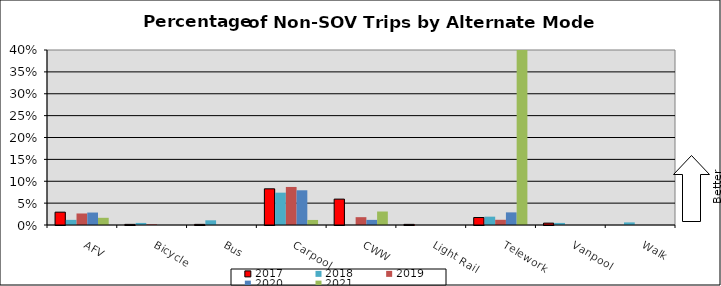
| Category | 2017 | 2018 | 2019 | 2020 | 2021 |
|---|---|---|---|---|---|
| AFV | 0.029 | 0.012 | 0.026 | 0.028 | 0.016 |
| Bicycle | 0.001 | 0.005 | 0.002 | 0 | 0 |
| Bus | 0.001 | 0.011 | 0 | 0 | 0 |
| Carpool | 0.083 | 0.074 | 0.087 | 0.079 | 0.012 |
| CWW | 0.059 | 0 | 0.018 | 0.012 | 0.031 |
| Light Rail | 0.001 | 0 | 0 | 0 | 0 |
| Telework | 0.017 | 0.019 | 0.012 | 0.029 | 0.437 |
| Vanpool | 0.004 | 0.005 | 0 | 0 | 0 |
| Walk | 0 | 0.006 | 0 | 0 | 0 |